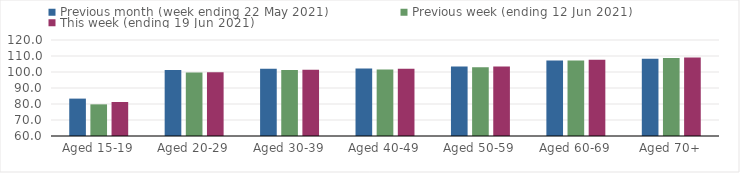
| Category | Previous month (week ending 22 May 2021) | Previous week (ending 12 Jun 2021) | This week (ending 19 Jun 2021) |
|---|---|---|---|
| Aged 15-19 | 83.37 | 79.78 | 81.24 |
| Aged 20-29 | 101.31 | 99.64 | 99.92 |
| Aged 30-39 | 102.1 | 101.26 | 101.45 |
| Aged 40-49 | 102.22 | 101.58 | 101.97 |
| Aged 50-59 | 103.43 | 102.98 | 103.44 |
| Aged 60-69 | 107.2 | 107.13 | 107.63 |
| Aged 70+ | 108.35 | 108.72 | 109.12 |